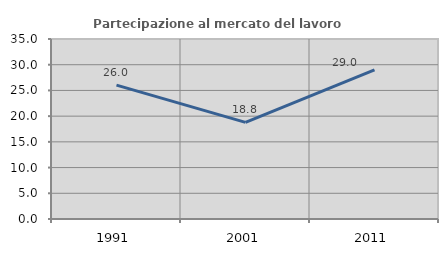
| Category | Partecipazione al mercato del lavoro  femminile |
|---|---|
| 1991.0 | 26.024 |
| 2001.0 | 18.786 |
| 2011.0 | 28.975 |